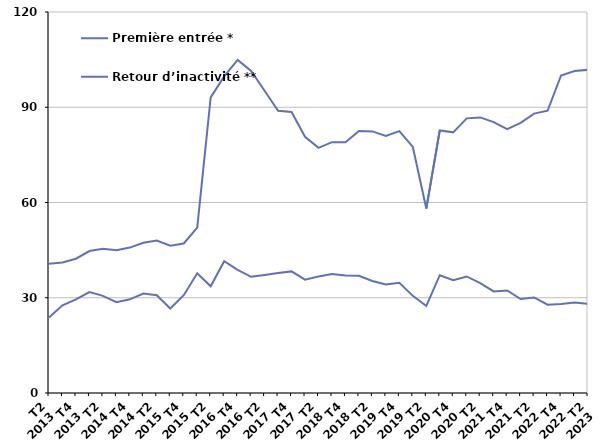
| Category | Première entrée * | Retour d’inactivité ** |
|---|---|---|
| T2
2013 | 23.8 | 40.7 |
| T3
2013 | 27.6 | 41.1 |
| T4
2013 | 29.5 | 42.3 |
| T1
2014 | 31.8 | 44.7 |
| T2
2014 | 30.6 | 45.4 |
| T3
2014 | 28.6 | 45 |
| T4
2014 | 29.5 | 45.8 |
| T1
2015 | 31.3 | 47.3 |
| T2
2015 | 30.8 | 48 |
| T3
2015 | 26.6 | 46.4 |
| T4
2015 | 30.8 | 47.1 |
| T1
2016 | 37.7 | 52.1 |
| T2
2016 | 33.6 | 93.1 |
| T3
2016 | 41.5 | 99.7 |
| T4
2016 | 38.8 | 104.9 |
| T1
2017 | 36.6 | 101.4 |
| T2
2017 | 37.2 | 95.2 |
| T3
2017 | 37.8 | 88.9 |
| T4
2017 | 38.3 | 88.5 |
| T1
2018 | 35.7 | 80.7 |
| T2
2018 | 36.7 | 77.2 |
| T3
2018 | 37.5 | 79 |
| T4
2018 | 37 | 79 |
| T1
2019 | 36.9 | 82.5 |
| T2
2019 | 35.3 | 82.4 |
| T3
2019 | 34.2 | 81 |
| T4
2019 | 34.7 | 82.5 |
| T1
2020 | 30.6 | 77.5 |
| T2
2020 | 27.4 | 58.1 |
| T3
2020 | 37.1 | 82.7 |
| T4
2020 | 35.5 | 82.1 |
| T1
2021 | 36.7 | 86.5 |
| T2
2021 | 34.6 | 86.8 |
| T3
2021 | 32 | 85.3 |
| T4
2021 | 32.3 | 83.1 |
| T1
2022 | 29.6 | 85.1 |
| T2
2022 | 30.1 | 88 |
| T3
2022 | 27.8 | 88.9 |
| T4
2022 | 28 | 100 |
| T1
2023 | 28.5 | 101.4 |
| T2
2023 | 28.1 | 101.8 |